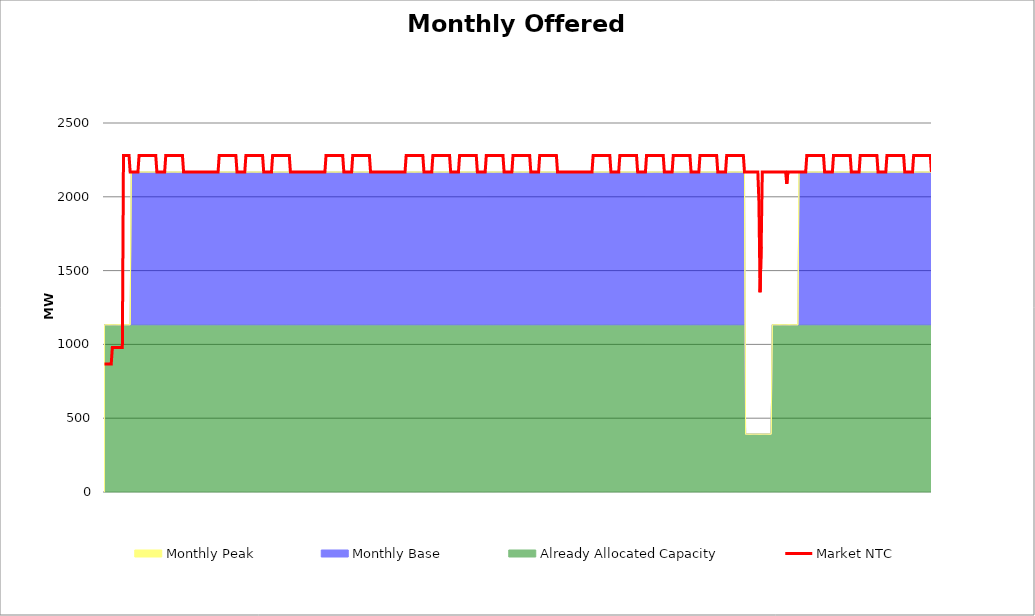
| Category | Market NTC |
|---|---|
| 0 | 868 |
| 1 | 868 |
| 2 | 868 |
| 3 | 868 |
| 4 | 868 |
| 5 | 868 |
| 6 | 868 |
| 7 | 979 |
| 8 | 979 |
| 9 | 979 |
| 10 | 979 |
| 11 | 979 |
| 12 | 979 |
| 13 | 979 |
| 14 | 979 |
| 15 | 979 |
| 16 | 979 |
| 17 | 2279 |
| 18 | 2279 |
| 19 | 2279 |
| 20 | 2279 |
| 21 | 2279 |
| 22 | 2279 |
| 23 | 2168 |
| 24 | 2168 |
| 25 | 2168 |
| 26 | 2168 |
| 27 | 2168 |
| 28 | 2168 |
| 29 | 2168 |
| 30 | 2168 |
| 31 | 2279 |
| 32 | 2279 |
| 33 | 2279 |
| 34 | 2279 |
| 35 | 2279 |
| 36 | 2279 |
| 37 | 2279 |
| 38 | 2279 |
| 39 | 2279 |
| 40 | 2279 |
| 41 | 2279 |
| 42 | 2279 |
| 43 | 2279 |
| 44 | 2279 |
| 45 | 2279 |
| 46 | 2279 |
| 47 | 2168 |
| 48 | 2168 |
| 49 | 2168 |
| 50 | 2168 |
| 51 | 2168 |
| 52 | 2168 |
| 53 | 2168 |
| 54 | 2168 |
| 55 | 2279 |
| 56 | 2279 |
| 57 | 2279 |
| 58 | 2279 |
| 59 | 2279 |
| 60 | 2279 |
| 61 | 2279 |
| 62 | 2279 |
| 63 | 2279 |
| 64 | 2279 |
| 65 | 2279 |
| 66 | 2279 |
| 67 | 2279 |
| 68 | 2279 |
| 69 | 2279 |
| 70 | 2279 |
| 71 | 2168 |
| 72 | 2168 |
| 73 | 2168 |
| 74 | 2168 |
| 75 | 2168 |
| 76 | 2168 |
| 77 | 2168 |
| 78 | 2168 |
| 79 | 2168 |
| 80 | 2168 |
| 81 | 2168 |
| 82 | 2168 |
| 83 | 2168 |
| 84 | 2168 |
| 85 | 2168 |
| 86 | 2168 |
| 87 | 2168 |
| 88 | 2168 |
| 89 | 2168 |
| 90 | 2168 |
| 91 | 2168 |
| 92 | 2168 |
| 93 | 2168 |
| 94 | 2168 |
| 95 | 2168 |
| 96 | 2168 |
| 97 | 2168 |
| 98 | 2168 |
| 99 | 2168 |
| 100 | 2168 |
| 101 | 2168 |
| 102 | 2168 |
| 103 | 2279 |
| 104 | 2279 |
| 105 | 2279 |
| 106 | 2279 |
| 107 | 2279 |
| 108 | 2279 |
| 109 | 2279 |
| 110 | 2279 |
| 111 | 2279 |
| 112 | 2279 |
| 113 | 2279 |
| 114 | 2279 |
| 115 | 2279 |
| 116 | 2279 |
| 117 | 2279 |
| 118 | 2279 |
| 119 | 2168 |
| 120 | 2168 |
| 121 | 2168 |
| 122 | 2168 |
| 123 | 2168 |
| 124 | 2168 |
| 125 | 2168 |
| 126 | 2168 |
| 127 | 2279 |
| 128 | 2279 |
| 129 | 2279 |
| 130 | 2279 |
| 131 | 2279 |
| 132 | 2279 |
| 133 | 2279 |
| 134 | 2279 |
| 135 | 2279 |
| 136 | 2279 |
| 137 | 2279 |
| 138 | 2279 |
| 139 | 2279 |
| 140 | 2279 |
| 141 | 2279 |
| 142 | 2279 |
| 143 | 2168 |
| 144 | 2168 |
| 145 | 2168 |
| 146 | 2168 |
| 147 | 2168 |
| 148 | 2168 |
| 149 | 2168 |
| 150 | 2168 |
| 151 | 2279 |
| 152 | 2279 |
| 153 | 2279 |
| 154 | 2279 |
| 155 | 2279 |
| 156 | 2279 |
| 157 | 2279 |
| 158 | 2279 |
| 159 | 2279 |
| 160 | 2279 |
| 161 | 2279 |
| 162 | 2279 |
| 163 | 2279 |
| 164 | 2279 |
| 165 | 2279 |
| 166 | 2279 |
| 167 | 2168 |
| 168 | 2168 |
| 169 | 2168 |
| 170 | 2168 |
| 171 | 2168 |
| 172 | 2168 |
| 173 | 2168 |
| 174 | 2168 |
| 175 | 2168 |
| 176 | 2168 |
| 177 | 2168 |
| 178 | 2168 |
| 179 | 2168 |
| 180 | 2168 |
| 181 | 2168 |
| 182 | 2168 |
| 183 | 2168 |
| 184 | 2168 |
| 185 | 2168 |
| 186 | 2168 |
| 187 | 2168 |
| 188 | 2168 |
| 189 | 2168 |
| 190 | 2168 |
| 191 | 2168 |
| 192 | 2168 |
| 193 | 2168 |
| 194 | 2168 |
| 195 | 2168 |
| 196 | 2168 |
| 197 | 2168 |
| 198 | 2168 |
| 199 | 2279 |
| 200 | 2279 |
| 201 | 2279 |
| 202 | 2279 |
| 203 | 2279 |
| 204 | 2279 |
| 205 | 2279 |
| 206 | 2279 |
| 207 | 2279 |
| 208 | 2279 |
| 209 | 2279 |
| 210 | 2279 |
| 211 | 2279 |
| 212 | 2279 |
| 213 | 2279 |
| 214 | 2279 |
| 215 | 2168 |
| 216 | 2168 |
| 217 | 2168 |
| 218 | 2168 |
| 219 | 2168 |
| 220 | 2168 |
| 221 | 2168 |
| 222 | 2168 |
| 223 | 2279 |
| 224 | 2279 |
| 225 | 2279 |
| 226 | 2279 |
| 227 | 2279 |
| 228 | 2279 |
| 229 | 2279 |
| 230 | 2279 |
| 231 | 2279 |
| 232 | 2279 |
| 233 | 2279 |
| 234 | 2279 |
| 235 | 2279 |
| 236 | 2279 |
| 237 | 2279 |
| 238 | 2279 |
| 239 | 2168 |
| 240 | 2168 |
| 241 | 2168 |
| 242 | 2168 |
| 243 | 2168 |
| 244 | 2168 |
| 245 | 2168 |
| 246 | 2168 |
| 247 | 2168 |
| 248 | 2168 |
| 249 | 2168 |
| 250 | 2168 |
| 251 | 2168 |
| 252 | 2168 |
| 253 | 2168 |
| 254 | 2168 |
| 255 | 2168 |
| 256 | 2168 |
| 257 | 2168 |
| 258 | 2168 |
| 259 | 2168 |
| 260 | 2168 |
| 261 | 2168 |
| 262 | 2168 |
| 263 | 2168 |
| 264 | 2168 |
| 265 | 2168 |
| 266 | 2168 |
| 267 | 2168 |
| 268 | 2168 |
| 269 | 2168 |
| 270 | 2168 |
| 271 | 2279 |
| 272 | 2279 |
| 273 | 2279 |
| 274 | 2279 |
| 275 | 2279 |
| 276 | 2279 |
| 277 | 2279 |
| 278 | 2279 |
| 279 | 2279 |
| 280 | 2279 |
| 281 | 2279 |
| 282 | 2279 |
| 283 | 2279 |
| 284 | 2279 |
| 285 | 2279 |
| 286 | 2279 |
| 287 | 2168 |
| 288 | 2168 |
| 289 | 2168 |
| 290 | 2168 |
| 291 | 2168 |
| 292 | 2168 |
| 293 | 2168 |
| 294 | 2168 |
| 295 | 2279 |
| 296 | 2279 |
| 297 | 2279 |
| 298 | 2279 |
| 299 | 2279 |
| 300 | 2279 |
| 301 | 2279 |
| 302 | 2279 |
| 303 | 2279 |
| 304 | 2279 |
| 305 | 2279 |
| 306 | 2279 |
| 307 | 2279 |
| 308 | 2279 |
| 309 | 2279 |
| 310 | 2279 |
| 311 | 2168 |
| 312 | 2168 |
| 313 | 2168 |
| 314 | 2168 |
| 315 | 2168 |
| 316 | 2168 |
| 317 | 2168 |
| 318 | 2168 |
| 319 | 2279 |
| 320 | 2279 |
| 321 | 2279 |
| 322 | 2279 |
| 323 | 2279 |
| 324 | 2279 |
| 325 | 2279 |
| 326 | 2279 |
| 327 | 2279 |
| 328 | 2279 |
| 329 | 2279 |
| 330 | 2279 |
| 331 | 2279 |
| 332 | 2279 |
| 333 | 2279 |
| 334 | 2279 |
| 335 | 2168 |
| 336 | 2168 |
| 337 | 2168 |
| 338 | 2168 |
| 339 | 2168 |
| 340 | 2168 |
| 341 | 2168 |
| 342 | 2168 |
| 343 | 2279 |
| 344 | 2279 |
| 345 | 2279 |
| 346 | 2279 |
| 347 | 2279 |
| 348 | 2279 |
| 349 | 2279 |
| 350 | 2279 |
| 351 | 2279 |
| 352 | 2279 |
| 353 | 2279 |
| 354 | 2279 |
| 355 | 2279 |
| 356 | 2279 |
| 357 | 2279 |
| 358 | 2279 |
| 359 | 2168 |
| 360 | 2168 |
| 361 | 2168 |
| 362 | 2168 |
| 363 | 2168 |
| 364 | 2168 |
| 365 | 2168 |
| 366 | 2168 |
| 367 | 2279 |
| 368 | 2279 |
| 369 | 2279 |
| 370 | 2279 |
| 371 | 2279 |
| 372 | 2279 |
| 373 | 2279 |
| 374 | 2279 |
| 375 | 2279 |
| 376 | 2279 |
| 377 | 2279 |
| 378 | 2279 |
| 379 | 2279 |
| 380 | 2279 |
| 381 | 2279 |
| 382 | 2279 |
| 383 | 2168 |
| 384 | 2168 |
| 385 | 2168 |
| 386 | 2168 |
| 387 | 2168 |
| 388 | 2168 |
| 389 | 2168 |
| 390 | 2168 |
| 391 | 2279 |
| 392 | 2279 |
| 393 | 2279 |
| 394 | 2279 |
| 395 | 2279 |
| 396 | 2279 |
| 397 | 2279 |
| 398 | 2279 |
| 399 | 2279 |
| 400 | 2279 |
| 401 | 2279 |
| 402 | 2279 |
| 403 | 2279 |
| 404 | 2279 |
| 405 | 2279 |
| 406 | 2279 |
| 407 | 2168 |
| 408 | 2168 |
| 409 | 2168 |
| 410 | 2168 |
| 411 | 2168 |
| 412 | 2168 |
| 413 | 2168 |
| 414 | 2168 |
| 415 | 2168 |
| 416 | 2168 |
| 417 | 2168 |
| 418 | 2168 |
| 419 | 2168 |
| 420 | 2168 |
| 421 | 2168 |
| 422 | 2168 |
| 423 | 2168 |
| 424 | 2168 |
| 425 | 2168 |
| 426 | 2168 |
| 427 | 2168 |
| 428 | 2168 |
| 429 | 2168 |
| 430 | 2168 |
| 431 | 2168 |
| 432 | 2168 |
| 433 | 2168 |
| 434 | 2168 |
| 435 | 2168 |
| 436 | 2168 |
| 437 | 2168 |
| 438 | 2168 |
| 439 | 2279 |
| 440 | 2279 |
| 441 | 2279 |
| 442 | 2279 |
| 443 | 2279 |
| 444 | 2279 |
| 445 | 2279 |
| 446 | 2279 |
| 447 | 2279 |
| 448 | 2279 |
| 449 | 2279 |
| 450 | 2279 |
| 451 | 2279 |
| 452 | 2279 |
| 453 | 2279 |
| 454 | 2279 |
| 455 | 2168 |
| 456 | 2168 |
| 457 | 2168 |
| 458 | 2168 |
| 459 | 2168 |
| 460 | 2168 |
| 461 | 2168 |
| 462 | 2168 |
| 463 | 2279 |
| 464 | 2279 |
| 465 | 2279 |
| 466 | 2279 |
| 467 | 2279 |
| 468 | 2279 |
| 469 | 2279 |
| 470 | 2279 |
| 471 | 2279 |
| 472 | 2279 |
| 473 | 2279 |
| 474 | 2279 |
| 475 | 2279 |
| 476 | 2279 |
| 477 | 2279 |
| 478 | 2279 |
| 479 | 2168 |
| 480 | 2168 |
| 481 | 2168 |
| 482 | 2168 |
| 483 | 2168 |
| 484 | 2168 |
| 485 | 2168 |
| 486 | 2168 |
| 487 | 2279 |
| 488 | 2279 |
| 489 | 2279 |
| 490 | 2279 |
| 491 | 2279 |
| 492 | 2279 |
| 493 | 2279 |
| 494 | 2279 |
| 495 | 2279 |
| 496 | 2279 |
| 497 | 2279 |
| 498 | 2279 |
| 499 | 2279 |
| 500 | 2279 |
| 501 | 2279 |
| 502 | 2279 |
| 503 | 2168 |
| 504 | 2168 |
| 505 | 2168 |
| 506 | 2168 |
| 507 | 2168 |
| 508 | 2168 |
| 509 | 2168 |
| 510 | 2168 |
| 511 | 2279 |
| 512 | 2279 |
| 513 | 2279 |
| 514 | 2279 |
| 515 | 2279 |
| 516 | 2279 |
| 517 | 2279 |
| 518 | 2279 |
| 519 | 2279 |
| 520 | 2279 |
| 521 | 2279 |
| 522 | 2279 |
| 523 | 2279 |
| 524 | 2279 |
| 525 | 2279 |
| 526 | 2279 |
| 527 | 2168 |
| 528 | 2168 |
| 529 | 2168 |
| 530 | 2168 |
| 531 | 2168 |
| 532 | 2168 |
| 533 | 2168 |
| 534 | 2168 |
| 535 | 2279 |
| 536 | 2279 |
| 537 | 2279 |
| 538 | 2279 |
| 539 | 2279 |
| 540 | 2279 |
| 541 | 2279 |
| 542 | 2279 |
| 543 | 2279 |
| 544 | 2279 |
| 545 | 2279 |
| 546 | 2279 |
| 547 | 2279 |
| 548 | 2279 |
| 549 | 2279 |
| 550 | 2279 |
| 551 | 2168 |
| 552 | 2168 |
| 553 | 2168 |
| 554 | 2168 |
| 555 | 2168 |
| 556 | 2168 |
| 557 | 2168 |
| 558 | 2168 |
| 559 | 2279 |
| 560 | 2279 |
| 561 | 2279 |
| 562 | 2279 |
| 563 | 2279 |
| 564 | 2279 |
| 565 | 2279 |
| 566 | 2279 |
| 567 | 2279 |
| 568 | 2279 |
| 569 | 2279 |
| 570 | 2279 |
| 571 | 2279 |
| 572 | 2279 |
| 573 | 2279 |
| 574 | 2279 |
| 575 | 2168 |
| 576 | 2168 |
| 577 | 2168 |
| 578 | 2168 |
| 579 | 2168 |
| 580 | 2168 |
| 581 | 2168 |
| 582 | 2168 |
| 583 | 2168 |
| 584 | 2168 |
| 585 | 2168 |
| 586 | 2168 |
| 587 | 2168 |
| 588 | 1963 |
| 589 | 1353 |
| 590 | 1662 |
| 591 | 2168 |
| 592 | 2168 |
| 593 | 2168 |
| 594 | 2168 |
| 595 | 2168 |
| 596 | 2168 |
| 597 | 2168 |
| 598 | 2168 |
| 599 | 2168 |
| 600 | 2168 |
| 601 | 2168 |
| 602 | 2168 |
| 603 | 2168 |
| 604 | 2168 |
| 605 | 2168 |
| 606 | 2168 |
| 607 | 2168 |
| 608 | 2168 |
| 609 | 2168 |
| 610 | 2168 |
| 611 | 2168 |
| 612 | 2168 |
| 613 | 2087 |
| 614 | 2168 |
| 615 | 2168 |
| 616 | 2168 |
| 617 | 2168 |
| 618 | 2168 |
| 619 | 2168 |
| 620 | 2168 |
| 621 | 2168 |
| 622 | 2168 |
| 623 | 2168 |
| 624 | 2168 |
| 625 | 2168 |
| 626 | 2168 |
| 627 | 2168 |
| 628 | 2168 |
| 629 | 2168 |
| 630 | 2168 |
| 631 | 2279 |
| 632 | 2279 |
| 633 | 2279 |
| 634 | 2279 |
| 635 | 2279 |
| 636 | 2279 |
| 637 | 2279 |
| 638 | 2279 |
| 639 | 2279 |
| 640 | 2279 |
| 641 | 2279 |
| 642 | 2279 |
| 643 | 2279 |
| 644 | 2279 |
| 645 | 2279 |
| 646 | 2279 |
| 647 | 2168 |
| 648 | 2168 |
| 649 | 2168 |
| 650 | 2168 |
| 651 | 2168 |
| 652 | 2168 |
| 653 | 2168 |
| 654 | 2168 |
| 655 | 2279 |
| 656 | 2279 |
| 657 | 2279 |
| 658 | 2279 |
| 659 | 2279 |
| 660 | 2279 |
| 661 | 2279 |
| 662 | 2279 |
| 663 | 2279 |
| 664 | 2279 |
| 665 | 2279 |
| 666 | 2279 |
| 667 | 2279 |
| 668 | 2279 |
| 669 | 2279 |
| 670 | 2279 |
| 671 | 2168 |
| 672 | 2168 |
| 673 | 2168 |
| 674 | 2168 |
| 675 | 2168 |
| 676 | 2168 |
| 677 | 2168 |
| 678 | 2168 |
| 679 | 2279 |
| 680 | 2279 |
| 681 | 2279 |
| 682 | 2279 |
| 683 | 2279 |
| 684 | 2279 |
| 685 | 2279 |
| 686 | 2279 |
| 687 | 2279 |
| 688 | 2279 |
| 689 | 2279 |
| 690 | 2279 |
| 691 | 2279 |
| 692 | 2279 |
| 693 | 2279 |
| 694 | 2279 |
| 695 | 2168 |
| 696 | 2168 |
| 697 | 2168 |
| 698 | 2168 |
| 699 | 2168 |
| 700 | 2168 |
| 701 | 2168 |
| 702 | 2168 |
| 703 | 2279 |
| 704 | 2279 |
| 705 | 2279 |
| 706 | 2279 |
| 707 | 2279 |
| 708 | 2279 |
| 709 | 2279 |
| 710 | 2279 |
| 711 | 2279 |
| 712 | 2279 |
| 713 | 2279 |
| 714 | 2279 |
| 715 | 2279 |
| 716 | 2279 |
| 717 | 2279 |
| 718 | 2279 |
| 719 | 2168 |
| 720 | 2168 |
| 721 | 2168 |
| 722 | 2168 |
| 723 | 2168 |
| 724 | 2168 |
| 725 | 2168 |
| 726 | 2168 |
| 727 | 2279 |
| 728 | 2279 |
| 729 | 2279 |
| 730 | 2279 |
| 731 | 2279 |
| 732 | 2279 |
| 733 | 2279 |
| 734 | 2279 |
| 735 | 2279 |
| 736 | 2279 |
| 737 | 2279 |
| 738 | 2279 |
| 739 | 2279 |
| 740 | 2279 |
| 741 | 2279 |
| 742 | 2279 |
| 743 | 2168 |